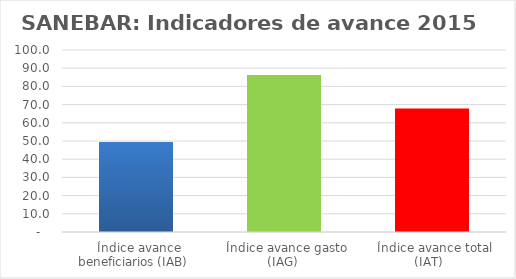
| Category | Series 0 |
|---|---|
| Índice avance beneficiarios (IAB)  | 49.416 |
| Índice avance gasto (IAG) | 86.276 |
| Índice avance total (IAT)  | 67.846 |